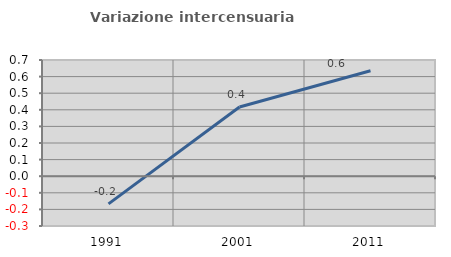
| Category | Variazione intercensuaria annua |
|---|---|
| 1991.0 | -0.167 |
| 2001.0 | 0.417 |
| 2011.0 | 0.635 |